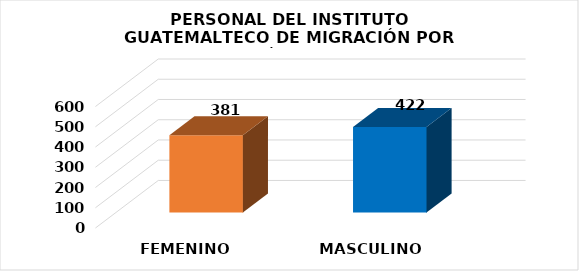
| Category | Series 0 |
|---|---|
| FEMENINO | 381 |
| MASCULINO | 422 |